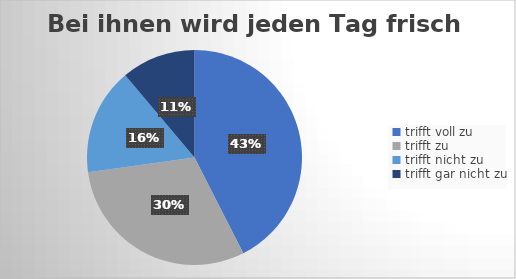
| Category | Bei ihnen wird jeden Tag frisch gekocht. |
|---|---|
| trifft voll zu | 122 |
| trifft zu  | 87 |
| trifft nicht zu  | 46 |
| trifft gar nicht zu | 32 |